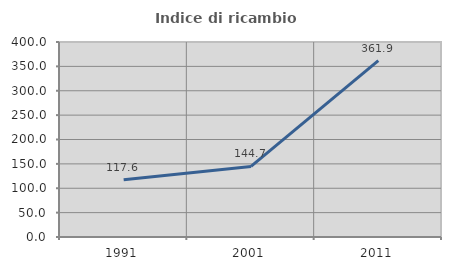
| Category | Indice di ricambio occupazionale  |
|---|---|
| 1991.0 | 117.588 |
| 2001.0 | 144.712 |
| 2011.0 | 361.947 |